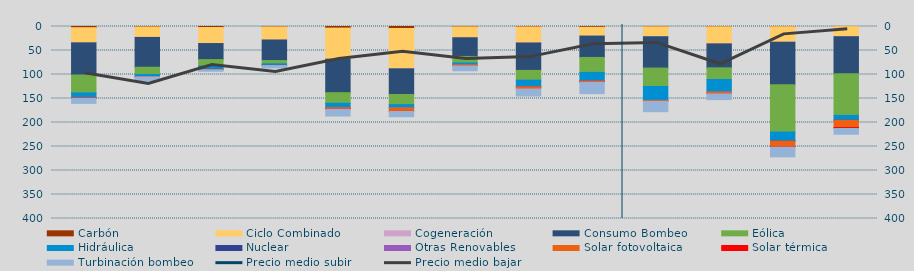
| Category | Carbón | Ciclo Combinado | Cogeneración | Consumo Bombeo | Eólica | Hidráulica | Nuclear | Otras Renovables | Solar fotovoltaica | Solar térmica | Turbinación bombeo |
|---|---|---|---|---|---|---|---|---|---|---|---|
| A | 2494.9 | 31290.063 | 376.8 | 66847.891 | 37361.887 | 10548.549 | 58.3 | 29.1 | 101.167 | 483.9 | 10705.8 |
| M | 916.05 | 21695.666 | 176.35 | 62054.792 | 15250.739 | 4379.143 | 0 | 39.1 | 143.784 | 110.5 | 9070.525 |
| J | 2154.975 | 33372.05 | 35.5 | 33404.025 | 13344.6 | 6713.425 | 395.875 | 16.375 | 385.65 | 221.25 | 3231.725 |
| J | 780.225 | 27400.075 | 8 | 42750.35 | 6759.125 | 3263.775 | 115 | 0 | 90.1 | 206.65 | 4895.275 |
| A | 3351.92 | 64804.475 | 20.75 | 69703.55 | 22031.853 | 9149.525 | 70.975 | 22.5 | 2685.85 | 505.375 | 14186.525 |
| S | 4138.5 | 84055.788 | 26 | 53462.35 | 21071.172 | 6988.753 | 0 | 0.85 | 7069.199 | 219.625 | 10948.251 |
| O | 766.425 | 22723.1 | 23.25 | 38873.508 | 13638.3 | 3548.975 | 0 | 0 | 2254.075 | 15.75 | 10421.953 |
| N | 882.249 | 33437.299 | 73.35 | 57054.7 | 20324.708 | 13802.882 | 172 | 5.375 | 4519.267 | 0 | 14514.075 |
| D | 1625.533 | 18353.308 | 50.675 | 44452.158 | 31169.809 | 17718.259 | 225.525 | 7.75 | 2457.35 | 4.225 | 23848.4 |
| E | 588.4 | 20714.524 | 113.817 | 65169.007 | 38379.733 | 28985.1 | 0 | 1 | 1727.433 | 24.9 | 21766.958 |
| F | 573.3 | 35655.65 | 48.25 | 49817.85 | 24354.625 | 25831 | 0 | 0 | 3770.725 | 69.225 | 12196.8 |
| M | 501.25 | 32124.392 | 164.517 | 88685.498 | 98417.968 | 18612.512 | 448.75 | 16.575 | 11880.15 | 572.625 | 20112.843 |
| A | 170 | 20766.184 | 571.725 | 76937.455 | 86761.121 | 10133.333 | 40.925 | 0 | 14988.025 | 2004.65 | 12082.525 |